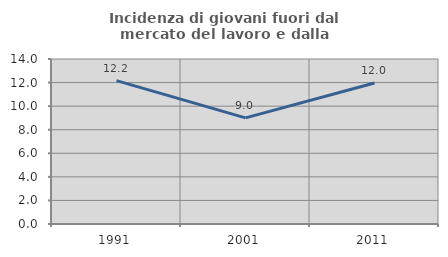
| Category | Incidenza di giovani fuori dal mercato del lavoro e dalla formazione  |
|---|---|
| 1991.0 | 12.162 |
| 2001.0 | 9.005 |
| 2011.0 | 11.962 |